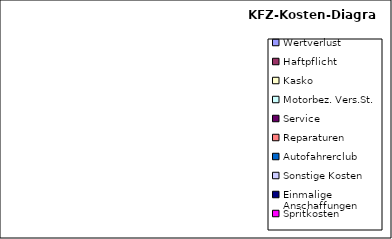
| Category | Series 0 |
|---|---|
| Wertverlust | 0 |
| Haftpflicht | 0 |
| Kasko | 0 |
| Motorbez. Vers.St. | 0 |
| Service | 0 |
| Reparaturen | 0 |
| Autofahrerclub | 0 |
| Sonstige Kosten | 0 |
| Einmalige Anschaffungen | 0 |
| Spritkosten | 0 |